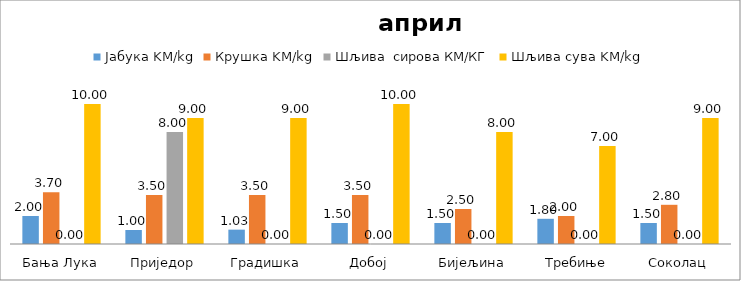
| Category | Јабука KM/kg | Крушка KM/kg | Шљива  сирова КМ/КГ | Шљива сува KM/kg |
|---|---|---|---|---|
| Бања Лука | 2 | 3.7 | 0 | 10 |
| Приједор | 1 | 3.5 | 8 | 9 |
| Градишка | 1.025 | 3.5 | 0 | 9 |
| Добој | 1.5 | 3.5 | 0 | 10 |
| Бијељина | 1.5 | 2.5 | 0 | 8 |
|  Требиње | 1.8 | 2 | 0 | 7 |
| Соколац | 1.5 | 2.8 | 0 | 9 |